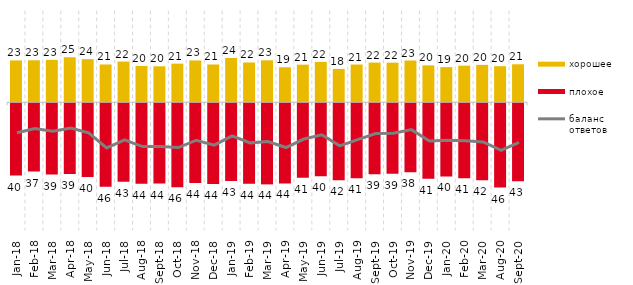
| Category | хорошее | плохое |
|---|---|---|
| 2018-01-01 | 22.9 | -39.6 |
| 2018-02-01 | 23 | -37.45 |
| 2018-03-01 | 23.2 | -39.1 |
| 2018-04-01 | 24.65 | -38.8 |
| 2018-05-01 | 23.6 | -40.4 |
| 2018-06-01 | 20.7 | -45.75 |
| 2018-07-01 | 22.3 | -42.95 |
| 2018-08-01 | 19.85 | -44.15 |
| 2018-09-01 | 19.7 | -44 |
| 2018-10-01 | 21.15 | -46 |
| 2018-11-01 | 22.904 | -43.713 |
| 2018-12-01 | 20.7 | -44.2 |
| 2019-01-01 | 24.25 | -42.65 |
| 2019-02-01 | 21.8 | -44.05 |
| 2019-03-01 | 22.974 | -44.455 |
| 2019-04-01 | 19.158 | -43.96 |
| 2019-05-01 | 20.604 | -40.763 |
| 2019-06-01 | 22.095 | -39.95 |
| 2019-07-01 | 18.267 | -42.129 |
| 2019-08-01 | 20.679 | -41.159 |
| 2019-09-01 | 21.733 | -38.911 |
| 2019-10-01 | 21.683 | -38.614 |
| 2019-11-01 | 22.871 | -37.871 |
| 2019-12-01 | 20.198 | -41.386 |
| 2020-01-01 | 19.257 | -40.099 |
| 2020-02-01 | 20.05 | -41.089 |
| 2020-03-01 | 20.476 | -42.191 |
| 2020-08-01 | 19.762 | -46.177 |
| 2020-09-01 | 20.806 | -42.758 |